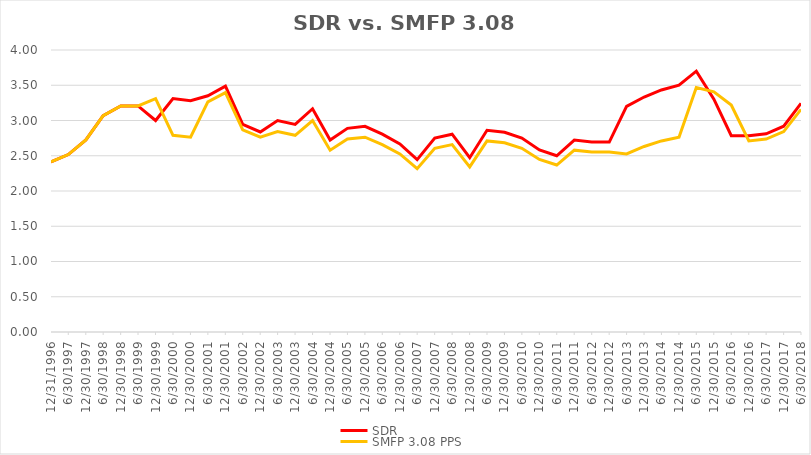
| Category | SDR | SMFP 3.08 PPS |
|---|---|---|
| 12/31/96 | 2.414 | 2.414 |
| 6/30/97 | 2.517 | 2.517 |
| 12/31/97 | 2.724 | 2.724 |
| 6/30/98 | 3.069 | 3.069 |
| 12/31/98 | 3.207 | 3.207 |
| 6/30/99 | 3.207 | 3.207 |
| 12/31/99 | 3 | 3.31 |
| 6/30/00 | 3.312 | 2.789 |
| 12/31/00 | 3.281 | 2.763 |
| 6/30/01 | 3.351 | 3.263 |
| 12/31/01 | 3.486 | 3.395 |
| 6/30/02 | 2.946 | 2.868 |
| 12/31/02 | 2.838 | 2.763 |
| 6/30/03 | 3 | 2.842 |
| 12/31/03 | 2.944 | 2.789 |
| 6/30/04 | 3.167 | 3 |
| 12/31/04 | 2.722 | 2.579 |
| 6/30/05 | 2.889 | 2.737 |
| 12/31/05 | 2.917 | 2.763 |
| 6/30/06 | 2.806 | 2.658 |
| 12/31/06 | 2.667 | 2.526 |
| 6/30/07 | 2.444 | 2.316 |
| 12/31/07 | 2.75 | 2.605 |
| 6/30/08 | 2.806 | 2.658 |
| 12/31/08 | 2.472 | 2.342 |
| 6/30/09 | 2.861 | 2.711 |
| 12/31/09 | 2.833 | 2.684 |
| 6/30/10 | 2.75 | 2.605 |
| 12/31/10 | 2.583 | 2.447 |
| 6/30/11 | 2.5 | 2.368 |
| 12/31/11 | 2.722 | 2.579 |
| 6/30/12 | 2.694 | 2.553 |
| 12/31/12 | 2.694 | 2.553 |
| 6/30/13 | 3.2 | 2.526 |
| 12/31/13 | 3.333 | 2.632 |
| 6/30/14 | 3.433 | 2.711 |
| 12/31/14 | 3.5 | 2.763 |
| 6/30/15 | 3.7 | 3.469 |
| 12/31/15 | 3.303 | 3.406 |
| 6/30/16 | 2.784 | 3.219 |
| 12/31/16 | 2.784 | 2.711 |
| 6/30/17 | 2.811 | 2.737 |
| 12/31/17 | 2.919 | 2.842 |
| 6/30/18 | 3.243 | 3.158 |